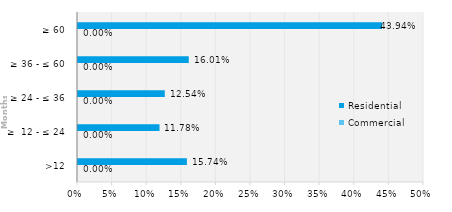
| Category | Commercial | Residential |
|---|---|---|
| >12 | 0 | 0.157 |
| ≥  12 - ≤ 24 | 0 | 0.118 |
| ≥ 24 - ≤ 36 | 0 | 0.125 |
| ≥ 36 - ≤ 60 | 0 | 0.16 |
| ≥ 60 | 0 | 0.439 |